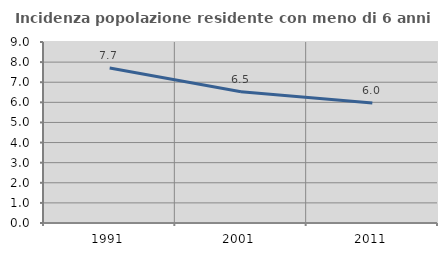
| Category | Incidenza popolazione residente con meno di 6 anni |
|---|---|
| 1991.0 | 7.709 |
| 2001.0 | 6.526 |
| 2011.0 | 5.964 |